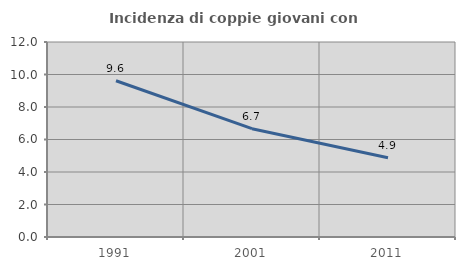
| Category | Incidenza di coppie giovani con figli |
|---|---|
| 1991.0 | 9.615 |
| 2001.0 | 6.667 |
| 2011.0 | 4.878 |